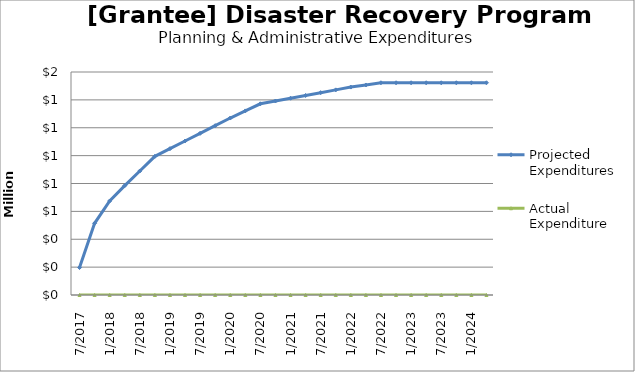
| Category | Projected Expenditures | Actual Expenditure |
|---|---|---|
| 7/2017 | 196882 | 0 |
| 10/2017 | 514545 | 0 |
| 1/2018 | 674545 | 0 |
| 4/2018 | 784545 | 0 |
| 7/2018 | 889819 | 0 |
| 10/2018 | 994819 | 0 |
| 1/2019 | 1049819 | 0 |
| 4/2019 | 1104819 | 0 |
| 7/2019 | 1159819 | 0 |
| 10/2019 | 1214819 | 0 |
| 1/2020 | 1269819 | 0 |
| 4/2020 | 1320819 | 0 |
| 7/2020 | 1371819 | 0 |
| 10/2020 | 1391819 | 0 |
| 1/2021 | 1411819 | 0 |
| 4/2021 | 1431819 | 0 |
| 7/2021 | 1451819 | 0 |
| 10/2021 | 1471819 | 0 |
| 1/2022 | 1491819 | 0 |
| 4/2022 | 1506819 | 0 |
| 7/2022 | 1522663 | 0 |
| 10/2022 | 1522663 | 0 |
| 1/2023 | 1522663 | 0 |
| 4/2023 | 1522663 | 0 |
| 7/2023 | 1522663 | 0 |
| 10/2023 | 1522663 | 0 |
| 1/2024 | 1522663 | 0 |
| 4/2024 | 1522663 | 0 |